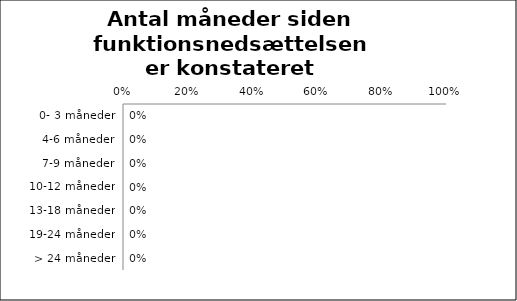
| Category | Antal måneder siden diagnosen blev stillet |
|---|---|
| 0- 3 måneder | 0 |
| 4-6 måneder | 0 |
| 7-9 måneder | 0 |
| 10-12 måneder | 0 |
| 13-18 måneder | 0 |
| 19-24 måneder | 0 |
| > 24 måneder | 0 |